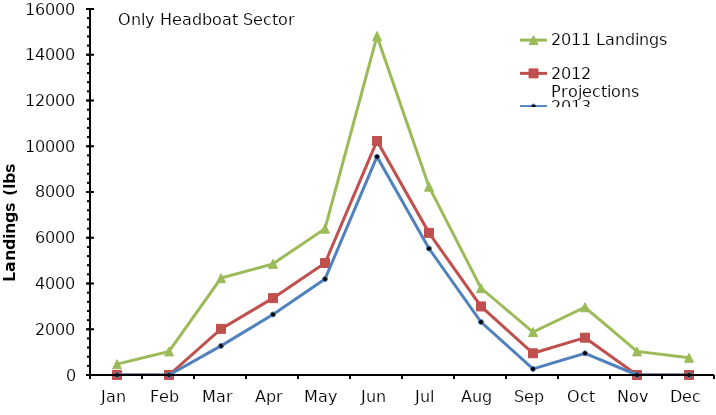
| Category | 2011 Landings | 2012 Projections | 2013 Projections |
|---|---|---|---|
| Jan | 473.75 | 0 | 0 |
| Feb | 1029.02 | 0 | 0 |
| Mar | 4232.62 | 2017.757 | 1271.787 |
| Apr | 4859.83 | 3359.71 | 2645.388 |
| May | 6397.07 | 4894.534 | 4196.225 |
| Jun | 14813.3 | 10231.295 | 9541.089 |
| Jul | 8229.55 | 6213.706 | 5527.6 |
| Aug | 3796.39 | 2996.98 | 2312.949 |
| Sep | 1875.7 | 948.131 | 265.15 |
| Oct | 2961.36 | 1631.247 | 948.797 |
| Nov | 1031.12 | 0 | 0 |
| Dec | 752.6 | 0 | 0 |